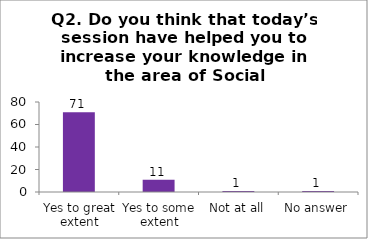
| Category | Q2. Do you think that today’s session have helped you to increase your knowledge in the area of Social Entrepreneurship? |
|---|---|
| Yes to great extent | 71 |
| Yes to some extent | 11 |
| Not at all | 1 |
| No answer | 1 |